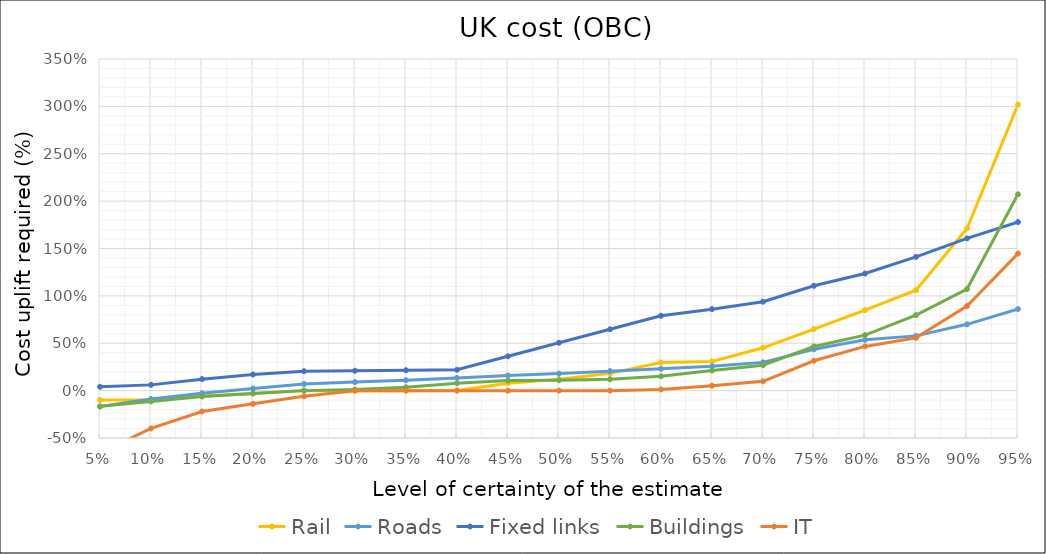
| Category | Rail | Roads | Fixed links | Buildings | IT |
|---|---|---|---|---|---|
| 0.05 | -0.098 | -0.168 | 0.04 | -0.166 | -0.657 |
| 0.1 | -0.098 | -0.088 | 0.061 | -0.114 | -0.399 |
| 0.15 | -0.058 | -0.028 | 0.121 | -0.062 | -0.22 |
| 0.2 | -0.03 | 0.021 | 0.17 | -0.03 | -0.14 |
| 0.25 | 0 | 0.07 | 0.205 | 0 | -0.06 |
| 0.3 | 0 | 0.09 | 0.21 | 0.012 | -0.001 |
| 0.35 | 0 | 0.11 | 0.215 | 0.036 | 0 |
| 0.4 | 0.002 | 0.134 | 0.22 | 0.078 | 0 |
| 0.45 | 0.079 | 0.16 | 0.363 | 0.106 | 0 |
| 0.5 | 0.121 | 0.18 | 0.505 | 0.11 | 0 |
| 0.55 | 0.182 | 0.206 | 0.648 | 0.12 | 0 |
| 0.6 | 0.296 | 0.23 | 0.79 | 0.152 | 0.012 |
| 0.65 | 0.308 | 0.257 | 0.86 | 0.212 | 0.052 |
| 0.7 | 0.452 | 0.298 | 0.938 | 0.268 | 0.098 |
| 0.75 | 0.649 | 0.436 | 1.106 | 0.466 | 0.315 |
| 0.8 | 0.85 | 0.536 | 1.236 | 0.586 | 0.467 |
| 0.85 | 1.06 | 0.578 | 1.412 | 0.797 | 0.557 |
| 0.9 | 1.71 | 0.7 | 1.607 | 1.072 | 0.892 |
| 0.95 | 3.018 | 0.861 | 1.779 | 2.072 | 1.447 |